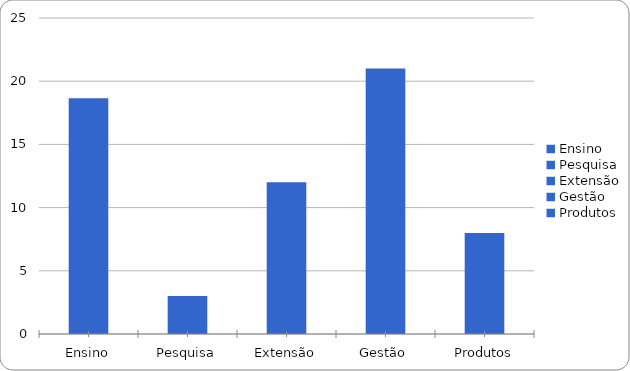
| Category | Series 0 |
|---|---|
| Ensino | 18.66 |
| Pesquisa | 3 |
| Extensão | 12 |
| Gestão | 21 |
| Produtos | 8 |